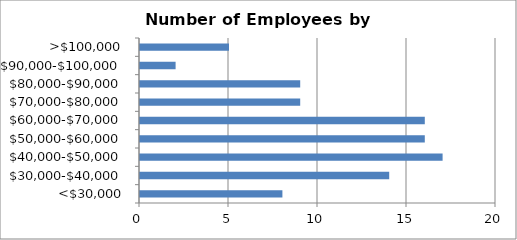
| Category | Series 0 |
|---|---|
| <$30,000 | 8 |
| $30,000-$40,000 | 14 |
| $40,000-$50,000 | 17 |
| $50,000-$60,000 | 16 |
| $60,000-$70,000 | 16 |
| $70,000-$80,000 | 9 |
| $80,000-$90,000 | 9 |
| $90,000-$100,000 | 2 |
| >$100,000 | 5 |